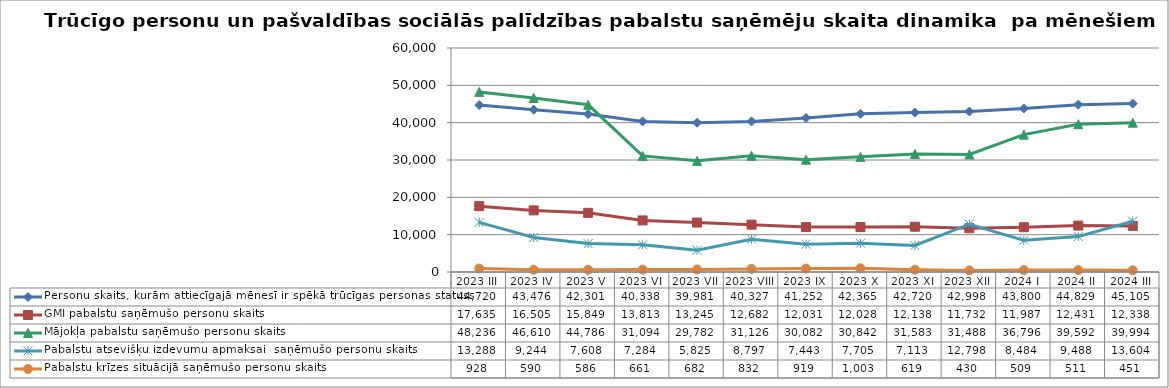
| Category | Personu skaits, kurām attiecīgajā mēnesī ir spēkā trūcīgas personas statuss | GMI pabalstu saņēmušo personu skaits | Mājokļa pabalstu saņēmušo personu skaits | Pabalstu atsevišķu izdevumu apmaksai  saņēmušo personu skaits | Pabalstu krīzes situācijā saņēmušo personu skaits |
|---|---|---|---|---|---|
| 2023 III | 44720 | 17635 | 48236 | 13288 | 928 |
| 2023 IV | 43476 | 16505 | 46610 | 9244 | 590 |
| 2023 V | 42301 | 15849 | 44786 | 7608 | 586 |
| 2023 VI | 40338 | 13813 | 31094 | 7284 | 661 |
| 2023 VII | 39981 | 13245 | 29782 | 5825 | 682 |
| 2023 VIII | 40327 | 12682 | 31126 | 8797 | 832 |
| 2023 IX | 41252 | 12031 | 30082 | 7443 | 919 |
| 2023 X | 42365 | 12028 | 30842 | 7705 | 1003 |
| 2023 XI | 42720 | 12138 | 31583 | 7113 | 619 |
| 2023 XII | 42998 | 11732 | 31488 | 12798 | 430 |
| 2024 I | 43800 | 11987 | 36796 | 8484 | 509 |
| 2024 II | 44829 | 12431 | 39592 | 9488 | 511 |
| 2024 III | 45105 | 12338 | 39994 | 13604 | 451 |